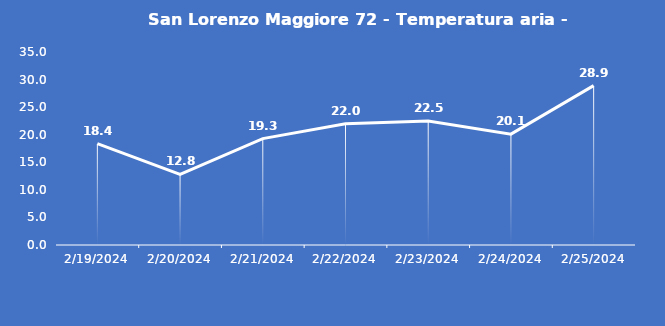
| Category | San Lorenzo Maggiore 72 - Temperatura aria - Grezzo (°C) |
|---|---|
| 2/19/24 | 18.4 |
| 2/20/24 | 12.8 |
| 2/21/24 | 19.3 |
| 2/22/24 | 22 |
| 2/23/24 | 22.5 |
| 2/24/24 | 20.1 |
| 2/25/24 | 28.9 |